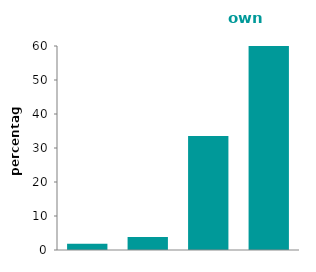
| Category | owns outright |
|---|---|
| 16-34 | 1.83 |
| 35-44 | 3.823 |
| 45-64 | 33.512 |
| 65 or over | 60.834 |